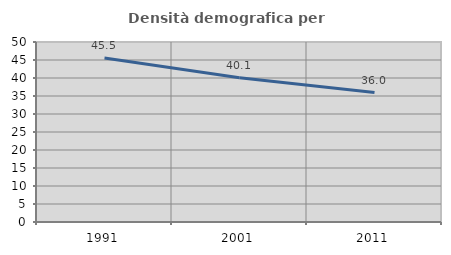
| Category | Densità demografica |
|---|---|
| 1991.0 | 45.548 |
| 2001.0 | 40.099 |
| 2011.0 | 35.959 |